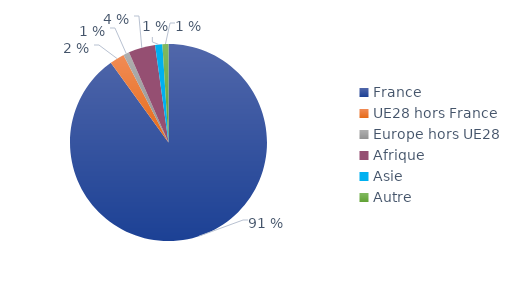
| Category | Series 0 |
|---|---|
| France | 0.912 |
| UE28 hors France | 0.024 |
| Europe hors UE28 | 0.01 |
| Afrique | 0.044 |
| Asie | 0.012 |
| Autre | 0.01 |